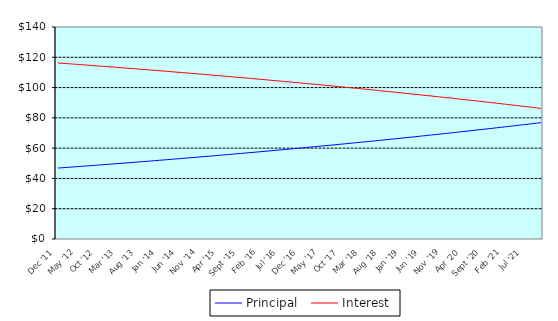
| Category | Principal | Interest |
|---|---|---|
| 0 | 46.85 | 116.25 |
| 1900-01-01 | 47.05 | 116.05 |
| 1900-01-02 | 47.24 | 115.86 |
| 1900-01-03 | 47.44 | 115.66 |
| 1900-01-04 | 47.64 | 115.46 |
| 1900-01-05 | 47.84 | 115.26 |
| 1900-01-06 | 48.04 | 115.06 |
| 1900-01-07 | 48.24 | 114.86 |
| 1900-01-08 | 48.44 | 114.66 |
| 1900-01-09 | 48.64 | 114.46 |
| 1900-01-10 | 48.84 | 114.26 |
| 1900-01-11 | 49.05 | 114.05 |
| 1900-01-12 | 49.25 | 113.85 |
| 1900-01-13 | 49.45 | 113.65 |
| 1900-01-14 | 49.66 | 113.44 |
| 1900-01-15 | 49.87 | 113.23 |
| 1900-01-16 | 50.08 | 113.02 |
| 1900-01-17 | 50.28 | 112.82 |
| 1900-01-18 | 50.49 | 112.61 |
| 1900-01-19 | 50.7 | 112.4 |
| 1900-01-20 | 50.92 | 112.18 |
| 1900-01-21 | 51.13 | 111.97 |
| 1900-01-22 | 51.34 | 111.76 |
| 1900-01-23 | 51.55 | 111.55 |
| 1900-01-24 | 51.77 | 111.33 |
| 1900-01-25 | 51.99 | 111.11 |
| 1900-01-26 | 52.2 | 110.9 |
| 1900-01-27 | 52.42 | 110.68 |
| 1900-01-28 | 52.64 | 110.46 |
| 1900-01-29 | 52.86 | 110.24 |
| 1900-01-30 | 53.08 | 110.02 |
| 1900-01-31 | 53.3 | 109.8 |
| 1900-02-01 | 53.52 | 109.58 |
| 1900-02-02 | 53.74 | 109.36 |
| 1900-02-03 | 53.97 | 109.13 |
| 1900-02-04 | 54.19 | 108.91 |
| 1900-02-05 | 54.42 | 108.68 |
| 1900-02-06 | 54.64 | 108.46 |
| 1900-02-07 | 54.87 | 108.23 |
| 1900-02-08 | 55.1 | 108 |
| 1900-02-09 | 55.33 | 107.77 |
| 1900-02-10 | 55.56 | 107.54 |
| 1900-02-11 | 55.79 | 107.31 |
| 1900-02-12 | 56.03 | 107.07 |
| 1900-02-13 | 56.26 | 106.84 |
| 1900-02-14 | 56.49 | 106.61 |
| 1900-02-15 | 56.73 | 106.37 |
| 1900-02-16 | 56.96 | 106.14 |
| 1900-02-17 | 57.2 | 105.9 |
| 1900-02-18 | 57.44 | 105.66 |
| 1900-02-19 | 57.68 | 105.42 |
| 1900-02-20 | 57.92 | 105.18 |
| 1900-02-21 | 58.16 | 104.94 |
| 1900-02-22 | 58.4 | 104.7 |
| 1900-02-23 | 58.65 | 104.45 |
| 1900-02-24 | 58.89 | 104.21 |
| 1900-02-25 | 59.14 | 103.96 |
| 1900-02-26 | 59.38 | 103.72 |
| 1900-02-27 | 59.63 | 103.47 |
| 1900-02-28 | 59.88 | 103.22 |
| 1900-02-28 | 60.13 | 102.97 |
| 1900-03-01 | 60.38 | 102.72 |
| 1900-03-02 | 60.63 | 102.47 |
| 1900-03-03 | 60.88 | 102.22 |
| 1900-03-04 | 61.14 | 101.96 |
| 1900-03-05 | 61.39 | 101.71 |
| 1900-03-06 | 61.65 | 101.45 |
| 1900-03-07 | 61.9 | 101.2 |
| 1900-03-08 | 62.16 | 100.94 |
| 1900-03-09 | 62.42 | 100.68 |
| 1900-03-10 | 62.68 | 100.42 |
| 1900-03-11 | 62.94 | 100.16 |
| 1900-03-12 | 63.2 | 99.9 |
| 1900-03-13 | 63.47 | 99.63 |
| 1900-03-14 | 63.73 | 99.37 |
| 1900-03-15 | 64 | 99.1 |
| 1900-03-16 | 64.26 | 98.84 |
| 1900-03-17 | 64.53 | 98.57 |
| 1900-03-18 | 64.8 | 98.3 |
| 1900-03-19 | 65.07 | 98.03 |
| 1900-03-20 | 65.34 | 97.76 |
| 1900-03-21 | 65.61 | 97.49 |
| 1900-03-22 | 65.89 | 97.21 |
| 1900-03-23 | 66.16 | 96.94 |
| 1900-03-24 | 66.44 | 96.66 |
| 1900-03-25 | 66.72 | 96.38 |
| 1900-03-26 | 66.99 | 96.11 |
| 1900-03-27 | 67.27 | 95.83 |
| 1900-03-28 | 67.55 | 95.55 |
| 1900-03-29 | 67.83 | 95.27 |
| 1900-03-30 | 68.12 | 94.98 |
| 1900-03-31 | 68.4 | 94.7 |
| 1900-04-01 | 68.69 | 94.41 |
| 1900-04-02 | 68.97 | 94.13 |
| 1900-04-03 | 69.26 | 93.84 |
| 1900-04-04 | 69.55 | 93.55 |
| 1900-04-05 | 69.84 | 93.26 |
| 1900-04-06 | 70.13 | 92.97 |
| 1900-04-07 | 70.42 | 92.68 |
| 1900-04-08 | 70.71 | 92.39 |
| 1900-04-09 | 71.01 | 92.09 |
| 1900-04-10 | 71.3 | 91.8 |
| 1900-04-11 | 71.6 | 91.5 |
| 1900-04-12 | 71.9 | 91.2 |
| 1900-04-13 | 72.2 | 90.9 |
| 1900-04-14 | 72.5 | 90.6 |
| 1900-04-15 | 72.8 | 90.3 |
| 1900-04-16 | 73.11 | 89.99 |
| 1900-04-17 | 73.41 | 89.69 |
| 1900-04-18 | 73.72 | 89.38 |
| 1900-04-19 | 74.02 | 89.08 |
| 1900-04-20 | 74.33 | 88.77 |
| 1900-04-21 | 74.64 | 88.46 |
| 1900-04-22 | 74.95 | 88.15 |
| 1900-04-23 | 75.27 | 87.83 |
| 1900-04-24 | 75.58 | 87.52 |
| 1900-04-25 | 75.89 | 87.21 |
| 1900-04-26 | 76.21 | 86.89 |
| 1900-04-27 | 76.53 | 86.57 |
| 1900-04-28 | 76.85 | 86.25 |